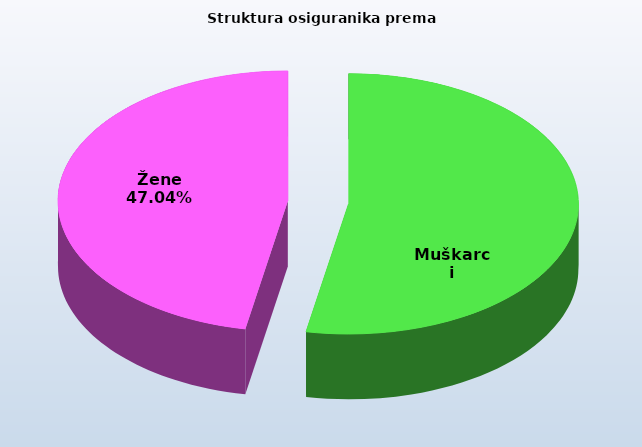
| Category | Series 0 |
|---|---|
| Muškarci | 849709 |
| Žene | 754744 |